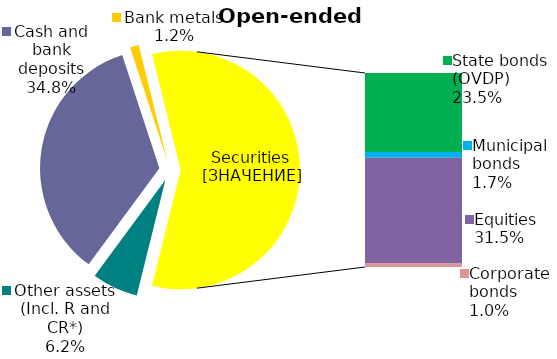
| Category | Series 0 |
|---|---|
| Other assets (Incl. R and CR*) | 0.062 |
| Cash and bank deposits | 0.348 |
| Bank metals | 0.012 |
| State bonds (OVDP) | 0.235 |
| Municipal bonds | 0.017 |
| Equities | 0.315 |
| Corporate bonds | 0.01 |